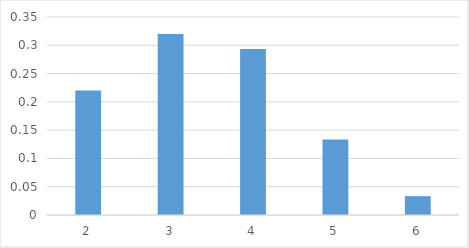
| Category | Series 0 |
|---|---|
| 2.0 | 0.22 |
| 3.0 | 0.32 |
| 4.0 | 0.293 |
| 5.0 | 0.133 |
| 6.0 | 0.033 |